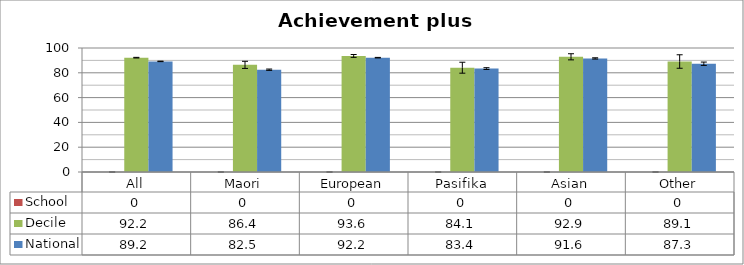
| Category | School | Decile | National |
|---|---|---|---|
| All | 0 | 92.2 | 89.2 |
| Maori | 0 | 86.4 | 82.5 |
| European | 0 | 93.6 | 92.2 |
| Pasifika | 0 | 84.1 | 83.4 |
| Asian | 0 | 92.9 | 91.6 |
| Other | 0 | 89.1 | 87.3 |